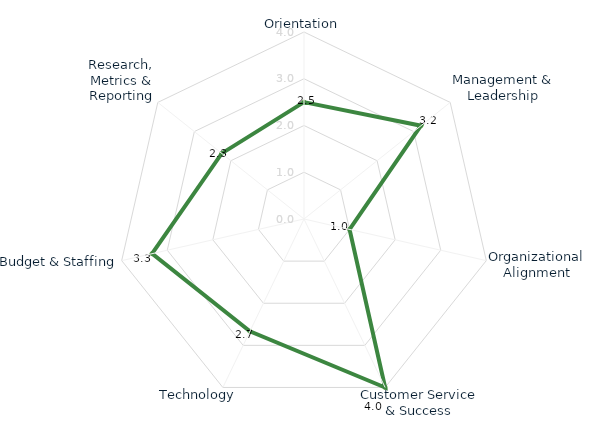
| Category | Series 0 |
|---|---|
| Orientation | 2.5 |
| Management & Leadership | 3.2 |
| Organizational Alignment | 1 |
| Customer Service & Success | 4 |
| Technology | 2.667 |
| Budget & Staffing | 3.333 |
| Research, Metrics & Reporting | 2.25 |